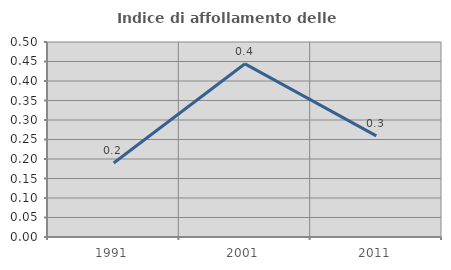
| Category | Indice di affollamento delle abitazioni  |
|---|---|
| 1991.0 | 0.19 |
| 2001.0 | 0.444 |
| 2011.0 | 0.259 |